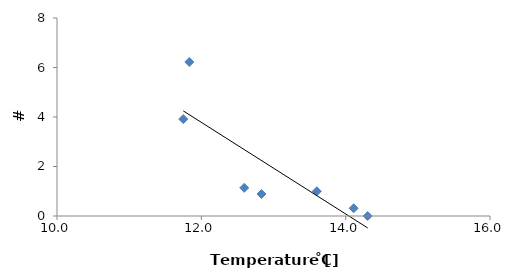
| Category | Ephemeroptera/Bag |
|---|---|
| 11.833333333 | 6.222 |
| 11.75 | 3.917 |
| 14.111111111 | 0.312 |
| 12.594444444 | 1.139 |
| 14.305555556 | 0 |
| 12.833333333 | 0.889 |
| 13.6 | 1 |